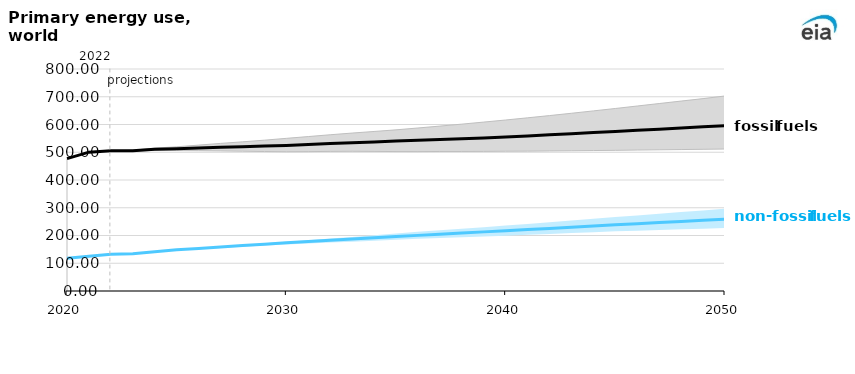
| Category | Non-Fossil Ref | Fossil Ref |
|---|---|---|
| 2020.0 | 118.36 | 476.95 |
| 2021.0 | 124.94 | 500.29 |
| 2022.0 | 132.09 | 505.74 |
| 2023.0 | 134.64 | 505.48 |
| 2024.0 | 141.31 | 511.12 |
| 2025.0 | 148.46 | 512.91 |
| 2026.0 | 153.33 | 515.18 |
| 2027.0 | 158.32 | 517.65 |
| 2028.0 | 163.63 | 519.72 |
| 2029.0 | 168.63 | 522.12 |
| 2030.0 | 173.45 | 524.74 |
| 2031.0 | 178.11 | 527.88 |
| 2032.0 | 182.78 | 531.4 |
| 2033.0 | 187.11 | 534.36 |
| 2034.0 | 191.68 | 537.29 |
| 2035.0 | 196.08 | 540.28 |
| 2036.0 | 200.45 | 543.12 |
| 2037.0 | 204.77 | 545.91 |
| 2038.0 | 208.93 | 548.83 |
| 2039.0 | 213.07 | 551.77 |
| 2040.0 | 217.22 | 554.98 |
| 2041.0 | 221.39 | 558.84 |
| 2042.0 | 225.63 | 562.85 |
| 2043.0 | 229.91 | 566.8 |
| 2044.0 | 234.26 | 570.89 |
| 2045.0 | 238.6 | 574.95 |
| 2046.0 | 242.67 | 579.01 |
| 2047.0 | 246.66 | 583.32 |
| 2048.0 | 250.68 | 587.54 |
| 2049.0 | 254.58 | 591.76 |
| 2050.0 | 258.64 | 596.1 |